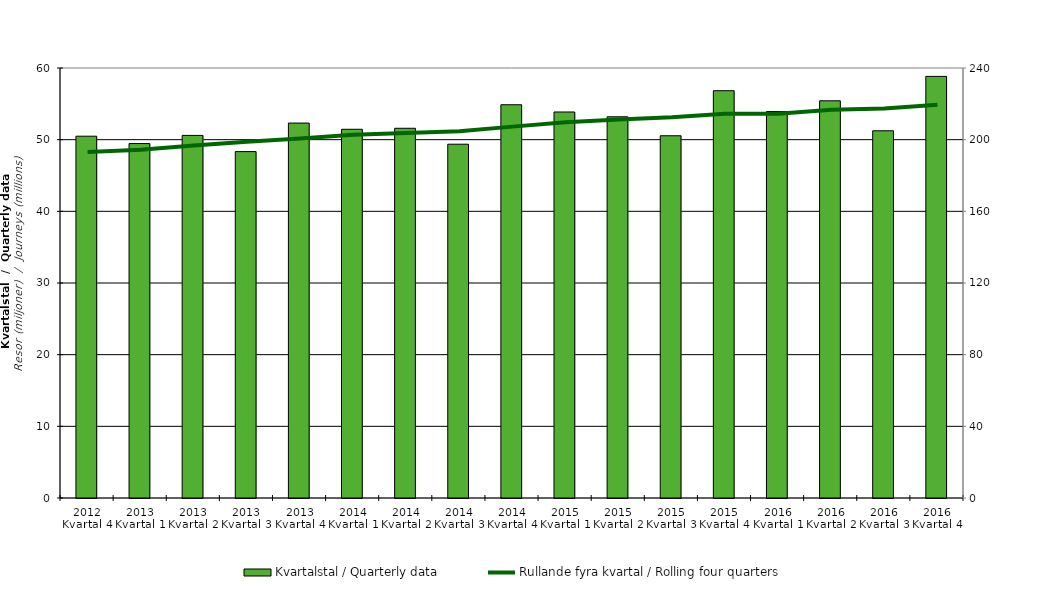
| Category | Kvartalstal / Quarterly data |
|---|---|
| 2012 Kvartal 4 | 50.484 |
| 2013 Kvartal 1 | 49.458 |
| 2013 Kvartal 2 | 50.596 |
| 2013 Kvartal 3 | 48.335 |
| 2013 Kvartal 4 | 52.317 |
| 2014 Kvartal 1 | 51.451 |
| 2014 Kvartal 2 | 51.589 |
| 2014 Kvartal 3 | 49.366 |
| 2014 Kvartal 4 | 54.874 |
| 2015 Kvartal 1 | 53.862 |
| 2015 Kvartal 2 | 53.194 |
| 2015 Kvartal 3 | 50.546 |
| 2015 Kvartal 4 | 56.832 |
| 2016 Kvartal 1 | 53.934 |
| 2016 Kvartal 2 | 55.423 |
| 2016 Kvartal 3 | 51.242 |
| 2016 Kvartal 4 | 58.83 |